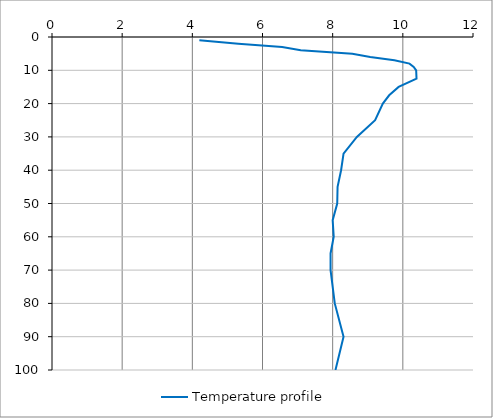
| Category | Temperature profile |
|---|---|
| 4.2 | 1 |
| 5.31 | 2 |
| 6.56 | 3 |
| 7.09 | 4 |
| 8.56 | 5 |
| 9.07 | 6 |
| 9.76 | 7 |
| 10.19 | 8 |
| 10.31 | 9 |
| 10.38 | 10 |
| 10.39 | 12.5 |
| 9.88 | 15 |
| 9.61 | 17.5 |
| 9.43 | 20 |
| 9.21 | 25 |
| 8.69 | 30 |
| 8.31 | 35 |
| 8.24 | 40 |
| 8.14 | 45 |
| 8.13 | 50 |
| 8.0 | 55 |
| 8.03 | 60 |
| 7.94 | 65 |
| 7.94 | 70 |
| 8.06 | 80 |
| 8.31 | 90 |
| 8.08 | 100 |